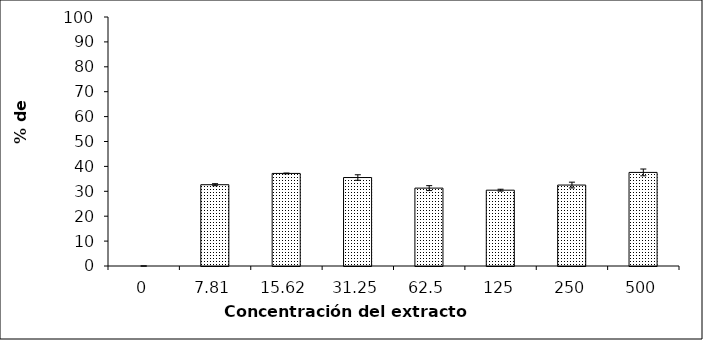
| Category | Series 0 |
|---|---|
| 0.0 | 0 |
| 7.81 | 32.647 |
| 15.62 | 37.174 |
| 31.25 | 35.528 |
| 62.5 | 31.276 |
| 125.0 | 30.453 |
| 250.0 | 32.51 |
| 500.0 | 37.586 |